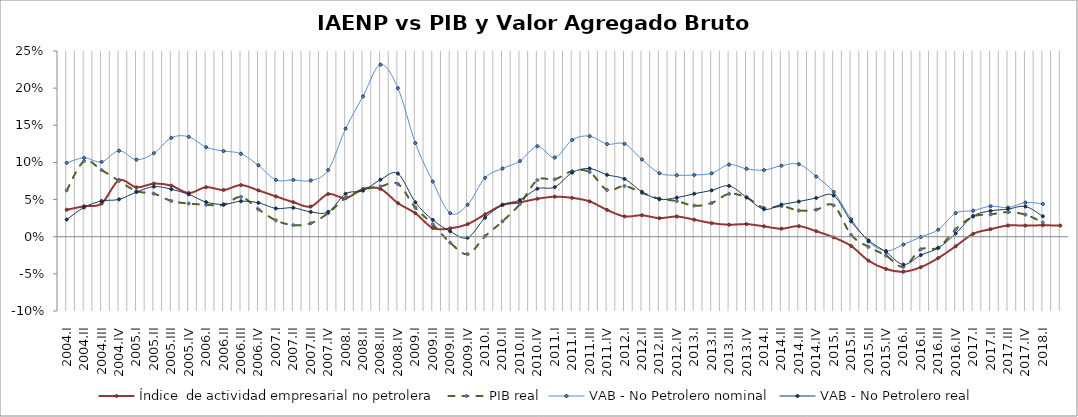
| Category | Índice  de actividad empresarial no petrolera | PIB real | VAB - No Petrolero nominal | VAB - No Petrolero real |
|---|---|---|---|---|
| 2004.I | 0.036 | 0.062 | 0.099 | 0.023 |
| 2004.II | 0.041 | 0.102 | 0.106 | 0.039 |
| 2004.III | 0.045 | 0.09 | 0.101 | 0.048 |
| 2004.IV | 0.076 | 0.075 | 0.116 | 0.05 |
| 2005.I | 0.066 | 0.061 | 0.104 | 0.06 |
| 2005.II | 0.071 | 0.058 | 0.112 | 0.067 |
| 2005.III | 0.069 | 0.048 | 0.133 | 0.064 |
| 2005.IV | 0.059 | 0.045 | 0.134 | 0.057 |
| 2006.I | 0.067 | 0.043 | 0.121 | 0.047 |
| 2006.II | 0.063 | 0.043 | 0.115 | 0.044 |
| 2006.III | 0.07 | 0.054 | 0.112 | 0.048 |
| 2006.IV | 0.062 | 0.037 | 0.096 | 0.046 |
| 2007.I | 0.054 | 0.022 | 0.076 | 0.038 |
| 2007.II | 0.047 | 0.016 | 0.076 | 0.039 |
| 2007.III | 0.041 | 0.018 | 0.076 | 0.033 |
| 2007.IV | 0.057 | 0.032 | 0.09 | 0.033 |
| 2008.I | 0.052 | 0.052 | 0.146 | 0.058 |
| 2008.II | 0.064 | 0.063 | 0.189 | 0.062 |
| 2008.III | 0.064 | 0.068 | 0.232 | 0.077 |
| 2008.IV | 0.045 | 0.071 | 0.2 | 0.085 |
| 2009.I | 0.032 | 0.039 | 0.126 | 0.046 |
| 2009.II | 0.012 | 0.017 | 0.074 | 0.023 |
| 2009.III | 0.011 | -0.008 | 0.032 | 0.007 |
| 2009.IV | 0.017 | -0.023 | 0.043 | -0.001 |
| 2010.I | 0.03 | 0.001 | 0.079 | 0.025 |
| 2010.II | 0.043 | 0.021 | 0.092 | 0.043 |
| 2010.III | 0.046 | 0.044 | 0.102 | 0.049 |
| 2010.IV | 0.051 | 0.076 | 0.122 | 0.065 |
| 2011.I | 0.054 | 0.077 | 0.107 | 0.067 |
| 2011.II | 0.052 | 0.088 | 0.13 | 0.086 |
| 2011.III | 0.048 | 0.087 | 0.135 | 0.092 |
| 2011.IV | 0.036 | 0.063 | 0.125 | 0.083 |
| 2012.I | 0.027 | 0.068 | 0.125 | 0.078 |
| 2012.II | 0.029 | 0.059 | 0.104 | 0.06 |
| 2012.III | 0.025 | 0.051 | 0.085 | 0.05 |
| 2012.IV | 0.027 | 0.048 | 0.083 | 0.053 |
| 2013.I | 0.023 | 0.042 | 0.083 | 0.058 |
| 2013.II | 0.018 | 0.045 | 0.085 | 0.062 |
| 2013.III | 0.016 | 0.058 | 0.097 | 0.068 |
| 2013.IV | 0.017 | 0.053 | 0.091 | 0.053 |
| 2014.I | 0.014 | 0.039 | 0.09 | 0.037 |
| 2014.II | 0.011 | 0.041 | 0.096 | 0.043 |
| 2014.III | 0.014 | 0.035 | 0.098 | 0.047 |
| 2014.IV | 0.007 | 0.036 | 0.081 | 0.052 |
| 2015.I | -0.001 | 0.042 | 0.06 | 0.055 |
| 2015.II | -0.012 | 0.002 | 0.024 | 0.021 |
| 2015.III | -0.032 | -0.014 | -0.006 | -0.005 |
| 2015.IV | -0.043 | -0.025 | -0.019 | -0.02 |
| 2016.I | -0.047 | -0.04 | -0.011 | -0.037 |
| 2016.II | -0.041 | -0.017 | 0 | -0.025 |
| 2016.III | -0.029 | -0.015 | 0.009 | -0.015 |
| 2016.IV | -0.013 | 0.01 | 0.032 | 0.004 |
| 2017.I | 0.004 | 0.027 | 0.035 | 0.028 |
| 2017.II | 0.01 | 0.03 | 0.041 | 0.035 |
| 2017.III | 0.015 | 0.033 | 0.039 | 0.037 |
| 2017.IV | 0.015 | 0.03 | 0.046 | 0.041 |
| 2018.I | 0.015 | 0.019 | 0.044 | 0.027 |